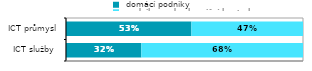
| Category |  domácí podniky |  podniky pod zahraniční kontrolou |
|---|---|---|
| ICT služby  | 0.318 | 0.682 |
| ICT průmysl | 0.529 | 0.471 |